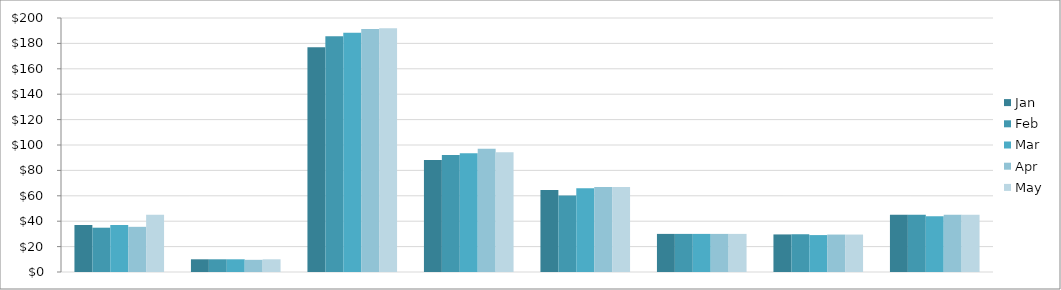
| Category |  Jan  |  Feb  |  Mar  |  Apr  |  May  |
|---|---|---|---|---|---|
| Dashboard Tutorial #1 | 37 | 34.886 | 37 | 35.572 | 45.12 |
| Excel Formula e-book | 10 | 10 | 10 | 9.583 | 10 |
| Excel School - Dashboards Membership | 177.042 | 185.6 | 188.297 | 191.278 | 191.96 |
| Excel School - Download Membership | 88.161 | 92.1 | 93.585 | 97 | 94.355 |
| Excel School - Online Membership | 64.5 | 60.2 | 66.043 | 67 | 67 |
| PM Templates for Excel [2003] | 30 | 30 | 30 | 30 | 30 |
| PM Templates for Excel [2007] | 29.583 | 29.731 | 29.075 | 29.474 | 29.478 |
| PM Templates for Excel [both] | 45 | 45 | 43.929 | 45 | 45 |